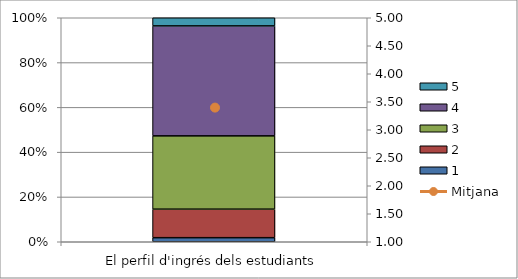
| Category | 1 | 2 | 3 | 4 | 5 |
|---|---|---|---|---|---|
| El perfil d'ingrés dels estudiants | 1 | 7 | 18 | 27 | 2 |